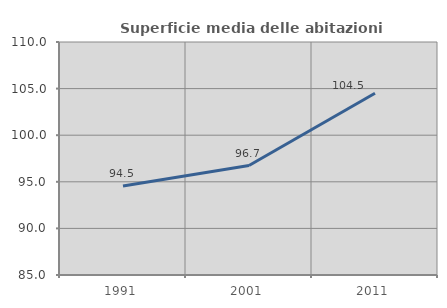
| Category | Superficie media delle abitazioni occupate |
|---|---|
| 1991.0 | 94.543 |
| 2001.0 | 96.745 |
| 2011.0 | 104.501 |